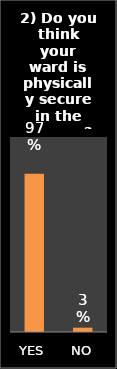
| Category | Series 0 |
|---|---|
| YES | 0.973 |
| NO | 0.027 |